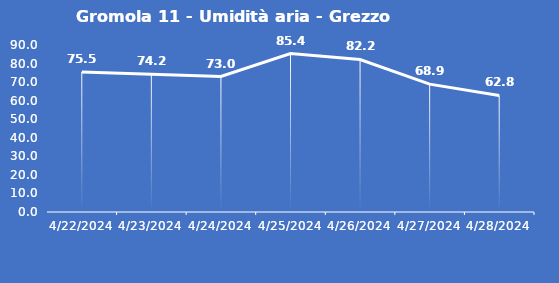
| Category | Gromola 11 - Umidità aria - Grezzo (%) |
|---|---|
| 4/22/24 | 75.5 |
| 4/23/24 | 74.2 |
| 4/24/24 | 73 |
| 4/25/24 | 85.4 |
| 4/26/24 | 82.2 |
| 4/27/24 | 68.9 |
| 4/28/24 | 62.8 |